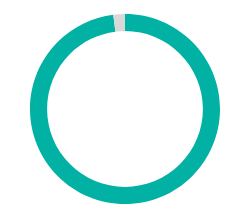
| Category | Series 0 |
|---|---|
| 0 | 0.98 |
| 1 | 0.02 |